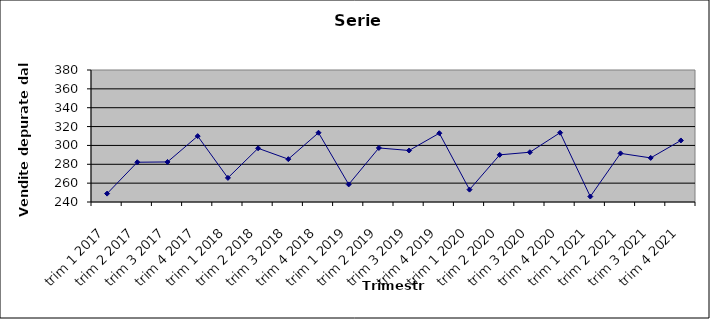
| Category | Serie detrendizzata |
|---|---|
| trim 1 2017 | 248.894 |
| trim 2 2017 | 282.187 |
| trim 3 2017 | 282.481 |
| trim 4 2017 | 309.875 |
| trim 1 2018 | 265.569 |
| trim 2 2018 | 296.962 |
| trim 3 2018 | 285.456 |
| trim 4 2018 | 313.45 |
| trim 1 2019 | 258.644 |
| trim 2 2019 | 297.337 |
| trim 3 2019 | 294.631 |
| trim 4 2019 | 312.925 |
| trim 1 2020 | 253.119 |
| trim 2 2020 | 290.012 |
| trim 3 2020 | 292.806 |
| trim 4 2020 | 313.5 |
| trim 1 2021 | 245.794 |
| trim 2 2021 | 291.587 |
| trim 3 2021 | 286.781 |
| trim 4 2021 | 305.275 |